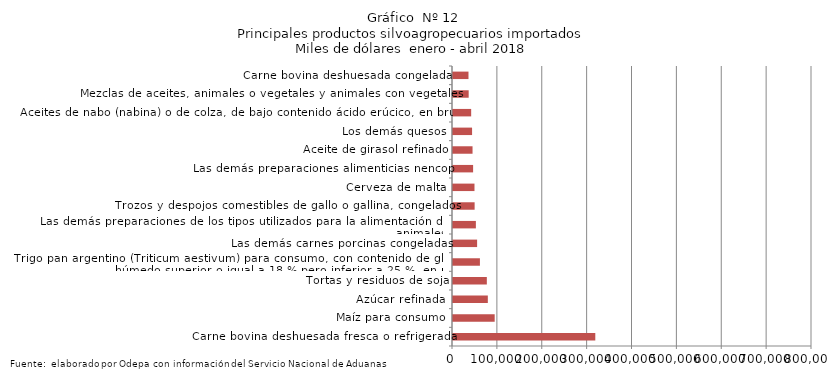
| Category | Series 0 |
|---|---|
| Carne bovina deshuesada fresca o refrigerada | 317102.407 |
| Maíz para consumo | 92892.318 |
| Azúcar refinada | 77616.15 |
| Tortas y residuos de soja | 75391.57 |
| Trigo pan argentino (Triticum aestivum) para consumo, con contenido de gluten húmedo superior o igual a 18 % pero inferior a 25 %, en peso | 59983.731 |
| Las demás carnes porcinas congeladas | 53729.152 |
| Las demás preparaciones de los tipos utilizados para la alimentación de los animales | 50977.216 |
| Trozos y despojos comestibles de gallo o gallina, congelados | 48190.155 |
| Cerveza de malta | 47887.091 |
| Las demás preparaciones alimenticias nencop | 44811.384 |
| Aceite de girasol refinado | 43547.779 |
| Los demás quesos | 42513.391 |
| Aceites de nabo (nabina) o de colza, de bajo contenido ácido erúcico, en bruto | 40492.039 |
| Mezclas de aceites, animales o vegetales y animales con vegetales | 34933.517 |
| Carne bovina deshuesada congelada | 34502.782 |